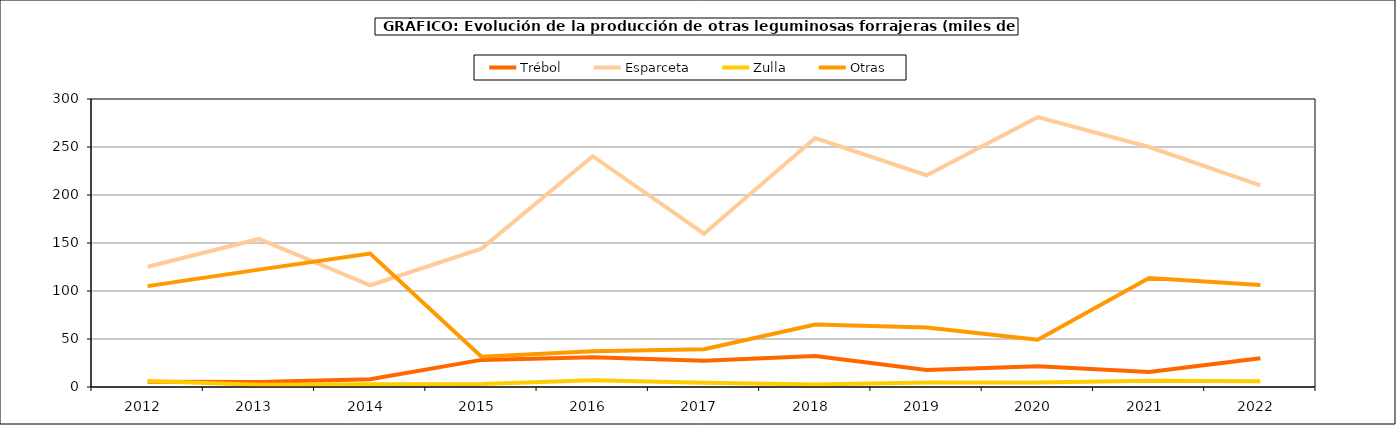
| Category | Trébol | Esparceta | Zulla | Otras |
|---|---|---|---|---|
| 2012.0 | 5.531 | 125.242 | 6.24 | 105.056 |
| 2013.0 | 5.243 | 154.216 | 2.307 | 122.265 |
| 2014.0 | 8 | 105.99 | 2.813 | 139.025 |
| 2015.0 | 28.241 | 144.128 | 3.1 | 31.635 |
| 2016.0 | 30.989 | 240.408 | 6.945 | 37.171 |
| 2017.0 | 27.256 | 159.694 | 4.469 | 39.33 |
| 2018.0 | 32.363 | 259.362 | 2.725 | 65.063 |
| 2019.0 | 17.749 | 220.568 | 4.575 | 62.006 |
| 2020.0 | 21.56 | 281.107 | 4.714 | 49.171 |
| 2021.0 | 15.607 | 249.964 | 6.627 | 113.43 |
| 2022.0 | 29.879 | 210.035 | 5.902 | 106.183 |